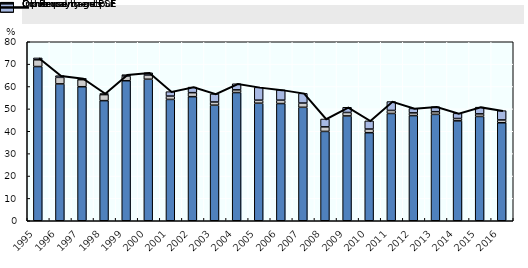
| Category | Commodity output | Input use | Other payments |
|---|---|---|---|
| 1995.0 | 68.921 | 3 | 0.852 |
| 1996.0 | 61.171 | 2.919 | 0.742 |
| 1997.0 | 59.909 | 3.142 | 0.572 |
| 1998.0 | 53.687 | 2.686 | 0.486 |
| 1999.0 | 62.577 | 2.104 | 0.604 |
| 2000.0 | 63.251 | 1.864 | 1.03 |
| 2001.0 | 54.229 | 1.484 | 1.987 |
| 2002.0 | 55.46 | 1.791 | 2.489 |
| 2003.0 | 51.652 | 1.427 | 3.599 |
| 2004.0 | 57.291 | 1.214 | 2.731 |
| 2005.0 | 52.529 | 1.366 | 5.714 |
| 2006.0 | 52.375 | 1.517 | 4.596 |
| 2007.0 | 50.699 | 1.9 | 4.336 |
| 2008.0 | 39.924 | 2.04 | 3.516 |
| 2009.0 | 46.839 | 1.553 | 2.323 |
| 2010.0 | 39.351 | 1.63 | 3.657 |
| 2011.0 | 47.953 | 1.349 | 3.967 |
| 2012.0 | 47.002 | 1.207 | 1.979 |
| 2013.0 | 47.548 | 1.199 | 2.222 |
| 2014.0 | 44.648 | 1.055 | 2.287 |
| 2015.0 | 46.617 | 1.155 | 3.002 |
| 2016.0 | 43.8 | 1.254 | 4.147 |